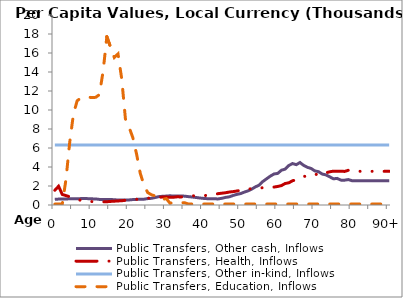
| Category | Public Transfers, Other cash, Inflows | Public Transfers, Health, Inflows | Public Transfers, Other in-kind, Inflows | Public Transfers, Education, Inflows |
|---|---|---|---|---|
| 0 | 609.824 | 1549.268 | 6302.72 | 98.408 |
|  | 619.768 | 1973.557 | 6302.72 | 98.408 |
| 2 | 629.712 | 1109.973 | 6302.72 | 98.408 |
| 3 | 639.657 | 988.532 | 6302.72 | 2714.769 |
| 4 | 649.601 | 867.092 | 6302.72 | 6606.377 |
| 5 | 659.545 | 745.651 | 6302.72 | 9559.188 |
| 6 | 649.532 | 623.036 | 6302.72 | 10966.348 |
| 7 | 675.66 | 479.63 | 6302.72 | 11284.431 |
| 8 | 681.931 | 428.17 | 6302.72 | 11331.776 |
| 9 | 667.918 | 398.538 | 6302.72 | 11342.723 |
| 10 | 646.391 | 358.405 | 6302.72 | 11315.233 |
| 11 | 639.386 | 350.918 | 6302.72 | 11332.286 |
| 12 | 587.808 | 337.504 | 6302.72 | 11625.023 |
| 13 | 587.373 | 331.929 | 6302.72 | 14109.312 |
| 14 | 583.666 | 343.838 | 6302.72 | 17718.365 |
| 15 | 578.687 | 377.034 | 6302.72 | 16613.973 |
| 16 | 555.575 | 400.778 | 6302.72 | 15529.928 |
| 17 | 522.605 | 427.022 | 6302.72 | 15906.424 |
| 18 | 514.266 | 449.966 | 6302.72 | 13281.106 |
| 19 | 517.319 | 496.38 | 6302.72 | 9055.135 |
| 20 | 534.645 | 562.995 | 6302.72 | 8164.423 |
| 21 | 572.332 | 592.273 | 6302.72 | 7080.373 |
| 22 | 594.306 | 592.393 | 6302.72 | 5358.814 |
| 23 | 605.348 | 654.535 | 6302.72 | 3327.359 |
| 24 | 613.638 | 675.755 | 6302.72 | 2073.555 |
| 25 | 672.61 | 722.548 | 6302.72 | 1310.546 |
| 26 | 702.515 | 729.338 | 6302.72 | 1078.68 |
| 27 | 790.2 | 763.775 | 6302.72 | 953.128 |
| 28 | 881.023 | 813.162 | 6302.72 | 560.863 |
| 29 | 917.074 | 835.445 | 6302.72 | 594.609 |
| 30 | 938.251 | 835.398 | 6302.72 | 675.386 |
| 31 | 970.208 | 807.753 | 6302.72 | 184.982 |
| 32 | 936.88 | 819.647 | 6302.72 | 270.351 |
| 33 | 934.23 | 863.848 | 6302.72 | 251.02 |
| 34 | 953.421 | 844.236 | 6302.72 | 252.866 |
| 35 | 927.789 | 908.674 | 6302.72 | 226.482 |
| 36 | 878.373 | 926.924 | 6302.72 | 98.408 |
| 37 | 841.45 | 969.621 | 6302.72 | 98.408 |
| 38 | 790.572 | 962.362 | 6302.72 | 98.408 |
| 39 | 738.317 | 965.768 | 6302.72 | 98.408 |
| 40 | 696.861 | 975.227 | 6302.72 | 98.408 |
| 41 | 665.262 | 1021.567 | 6302.72 | 98.408 |
| 42 | 660.348 | 1084.769 | 6302.72 | 98.408 |
| 43 | 648.613 | 1115.038 | 6302.72 | 98.408 |
| 44 | 641.199 | 1196.916 | 6302.72 | 98.408 |
| 45 | 708.33 | 1243.763 | 6302.72 | 98.408 |
| 46 | 804.075 | 1292.044 | 6302.72 | 98.408 |
| 47 | 862.981 | 1367.341 | 6302.72 | 98.408 |
| 48 | 1004.678 | 1409.438 | 6302.72 | 98.408 |
| 49 | 1116.199 | 1472.284 | 6302.72 | 98.408 |
| 50 | 1201.34 | 1542.006 | 6302.72 | 98.408 |
| 51 | 1353.049 | 1611.185 | 6302.72 | 98.408 |
| 52 | 1486.43 | 1684.433 | 6302.72 | 98.408 |
| 53 | 1676.287 | 1708.956 | 6302.72 | 98.408 |
| 54 | 1908.935 | 1782.561 | 6302.72 | 98.408 |
| 55 | 2086.779 | 1777.563 | 6302.72 | 98.408 |
| 56 | 2472.513 | 1820.027 | 6302.72 | 98.408 |
| 57 | 2756.308 | 1836.991 | 6302.72 | 98.408 |
| 58 | 3035.82 | 1849.809 | 6302.72 | 98.408 |
| 59 | 3263.666 | 1888.176 | 6302.72 | 98.408 |
| 60 | 3326.376 | 1952.903 | 6302.72 | 98.408 |
| 61 | 3658.475 | 2043.663 | 6302.72 | 98.408 |
| 62 | 3778.363 | 2263.624 | 6302.72 | 98.408 |
| 63 | 4160.574 | 2337.131 | 6302.72 | 98.408 |
| 64 | 4362.181 | 2556.37 | 6302.72 | 98.408 |
| 65 | 4245.522 | 2643.43 | 6302.72 | 98.408 |
| 66 | 4470.814 | 2917.404 | 6302.72 | 98.408 |
| 67 | 4162.387 | 3003.68 | 6302.72 | 98.408 |
| 68 | 3965.23 | 3056.73 | 6302.72 | 98.408 |
| 69 | 3841.367 | 3239.563 | 6302.72 | 98.408 |
| 70 | 3589.801 | 3189.799 | 6302.72 | 98.408 |
| 71 | 3504.718 | 3272.512 | 6302.72 | 98.408 |
| 72 | 3254.646 | 3493.992 | 6302.72 | 98.408 |
| 73 | 3170 | 3392.042 | 6302.72 | 98.408 |
| 74 | 2966.945 | 3494.781 | 6302.72 | 98.408 |
| 75 | 2755.607 | 3562.51 | 6302.72 | 98.408 |
| 76 | 2800.322 | 3564.491 | 6302.72 | 98.408 |
| 77 | 2618.206 | 3562.299 | 6302.72 | 98.408 |
| 78 | 2611.127 | 3532.577 | 6302.72 | 98.408 |
| 79 | 2676.252 | 3651.73 | 6302.72 | 98.408 |
| 80 | 2558.245 | 3546.417 | 6302.72 | 98.408 |
| 81 | 2558.245 | 3546.417 | 6302.72 | 98.408 |
| 82 | 2558.245 | 3546.417 | 6302.72 | 98.408 |
| 83 | 2558.245 | 3546.417 | 6302.72 | 98.408 |
| 84 | 2558.245 | 3546.417 | 6302.72 | 98.408 |
| 85 | 2558.245 | 3546.417 | 6302.72 | 98.408 |
| 86 | 2558.245 | 3546.417 | 6302.72 | 98.408 |
| 87 | 2558.245 | 3546.417 | 6302.72 | 98.408 |
| 88 | 2558.245 | 3546.417 | 6302.72 | 98.408 |
| 89 | 2558.245 | 3546.417 | 6302.72 | 98.408 |
| 90+ | 2558.245 | 3546.417 | 6302.72 | 98.408 |